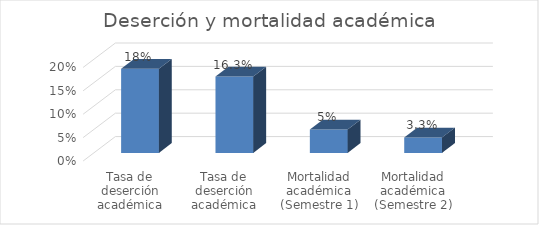
| Category | Series 0 |
|---|---|
| Tasa de deserción académica (semestre 1) | 0.18 |
| Tasa de deserción académica (semestre 2) | 0.163 |
| Mortalidad académica (Semestre 1) | 0.05 |
| Mortalidad académica (Semestre 2) | 0.033 |